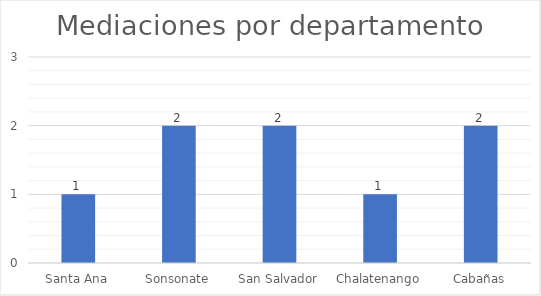
| Category | Socializaciones |
|---|---|
| Santa Ana | 1 |
| Sonsonate | 2 |
| San Salvador | 2 |
| Chalatenango | 1 |
| Cabañas | 2 |